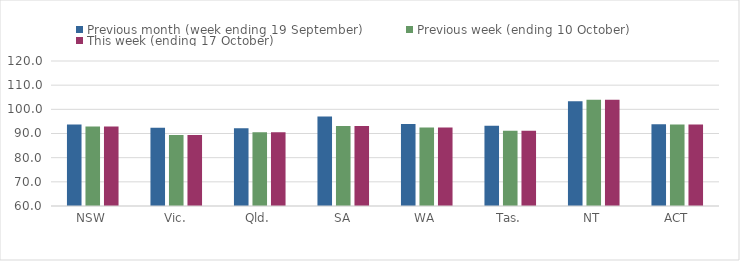
| Category | Previous month (week ending 19 September) | Previous week (ending 10 October) | This week (ending 17 October) |
|---|---|---|---|
| NSW | 93.74 | 92.93 | 92.93 |
| Vic. | 92.41 | 89.41 | 89.41 |
| Qld. | 92.2 | 90.53 | 90.53 |
| SA | 97.03 | 93.13 | 93.13 |
| WA | 93.91 | 92.45 | 92.45 |
| Tas. | 93.25 | 91.13 | 91.13 |
| NT | 103.35 | 103.96 | 103.96 |
| ACT | 93.85 | 93.76 | 93.76 |